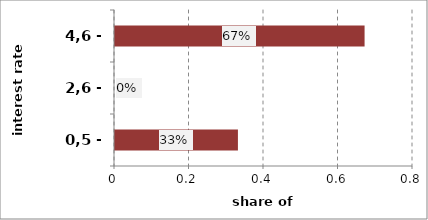
| Category | Series 0 |
|---|---|
| 0,5 - 2,5 | 0.33 |
| 2,6 - 4,5 | 0 |
| 4,6 - 6,5 | 0.67 |